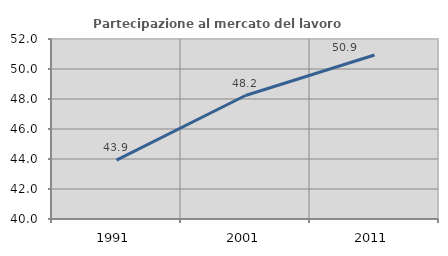
| Category | Partecipazione al mercato del lavoro  femminile |
|---|---|
| 1991.0 | 43.927 |
| 2001.0 | 48.232 |
| 2011.0 | 50.934 |